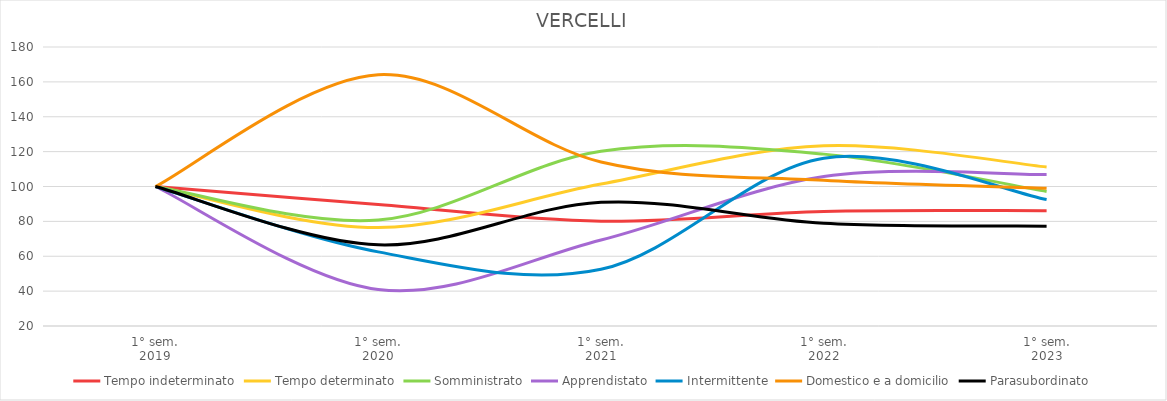
| Category | Tempo indeterminato | Tempo determinato | Somministrato | Apprendistato | Intermittente | Domestico e a domicilio | Parasubordinato |
|---|---|---|---|---|---|---|---|
| 1° sem.
2019 | 100 | 100 | 100 | 100 | 100 | 100 | 100 |
| 1° sem.
2020 | 89.637 | 76.44 | 80.727 | 40.909 | 62.5 | 164.07 | 66.529 |
| 1° sem.
2021 | 80.081 | 101.414 | 120.182 | 69.318 | 52.5 | 114.07 | 90.909 |
| 1° sem.
2022 | 85.734 | 123.351 | 118.567 | 105.682 | 116.25 | 103.518 | 78.926 |
| 1° sem.
2023 | 86.137 | 111.204 | 97.175 | 106.818 | 92.5 | 98.995 | 77.273 |